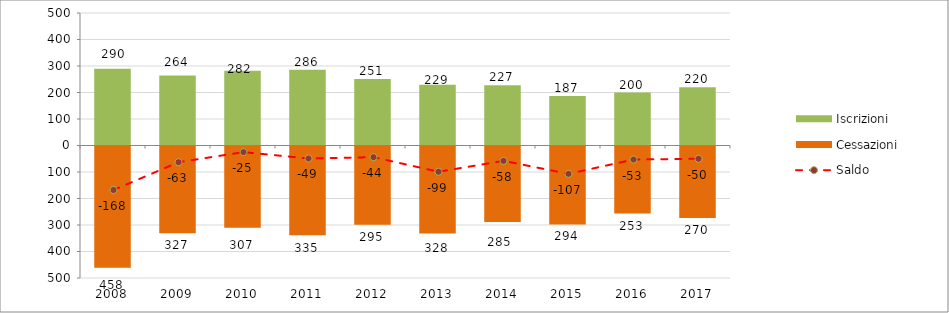
| Category | Iscrizioni | Cessazioni |
|---|---|---|
| 2008.0 | 290 | -458 |
| 2009.0 | 264 | -327 |
| 2010.0 | 282 | -307 |
| 2011.0 | 286 | -335 |
| 2012.0 | 251 | -295 |
| 2013.0 | 229 | -328 |
| 2014.0 | 227 | -285 |
| 2015.0 | 187 | -294 |
| 2016.0 | 200 | -253 |
| 2017.0 | 220 | -270 |